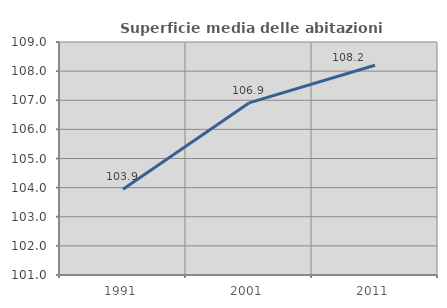
| Category | Superficie media delle abitazioni occupate |
|---|---|
| 1991.0 | 103.948 |
| 2001.0 | 106.909 |
| 2011.0 | 108.2 |